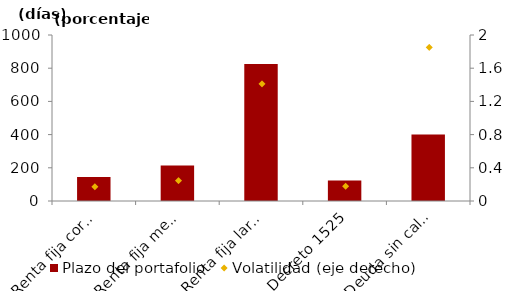
| Category | Plazo del portafolio  |
|---|---|
| Renta fija corto plazo | 144.65 |
| Renta fija mediano plazo | 213.205 |
| Renta fija largo plazo | 825.923 |
| Decreto 1525 | 122.812 |
| Deuda sin calificación | 399.96 |